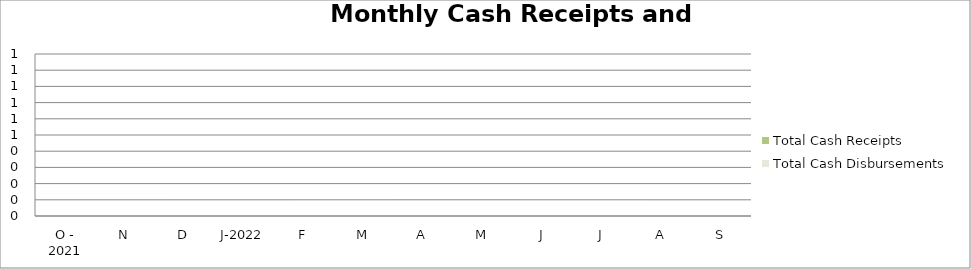
| Category | Total Cash Receipts | Total Cash Disbursements |
|---|---|---|
| O - 2021 | 0 | 0 |
| N | 0 | 0 |
| D | 0 | 0 |
| J-2022 | 0 | 0 |
| F | 0 | 0 |
| M | 0 | 0 |
| A | 0 | 0 |
| M | 0 | 0 |
| J | 0 | 0 |
| J | 0 | 0 |
| A | 0 | 0 |
| S | 0 | 0 |